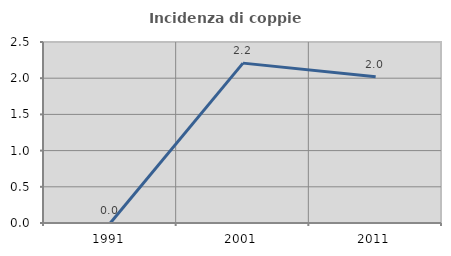
| Category | Incidenza di coppie miste |
|---|---|
| 1991.0 | 0 |
| 2001.0 | 2.208 |
| 2011.0 | 2.02 |